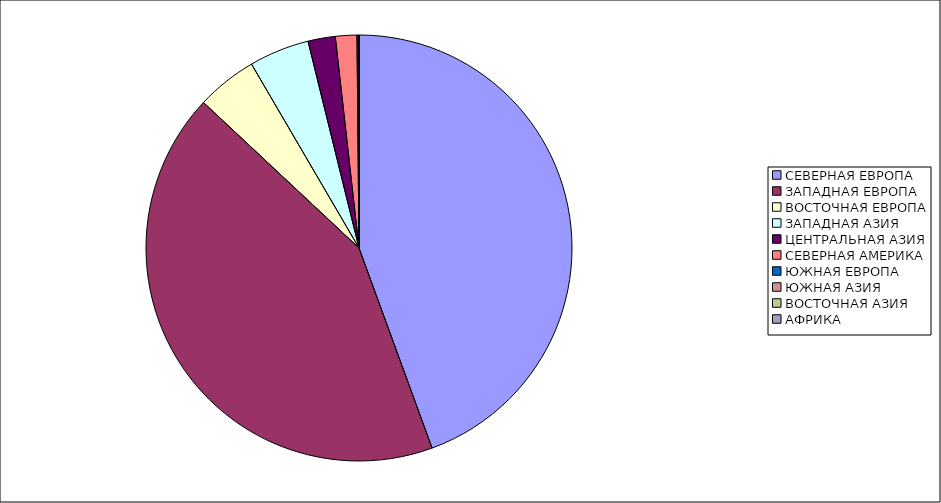
| Category | Оборот |
|---|---|
| СЕВЕРНАЯ ЕВРОПА | 44.43 |
| ЗАПАДНАЯ ЕВРОПА | 42.55 |
| ВОСТОЧНАЯ ЕВРОПА | 4.61 |
| ЗАПАДНАЯ АЗИЯ | 4.57 |
| ЦЕНТРАЛЬНАЯ АЗИЯ | 2.07 |
| СЕВЕРНАЯ АМЕРИКА | 1.63 |
| ЮЖНАЯ ЕВРОПА | 0.11 |
| ЮЖНАЯ АЗИЯ | 0.02 |
| ВОСТОЧНАЯ АЗИЯ | 0.01 |
| АФРИКА | 0.01 |